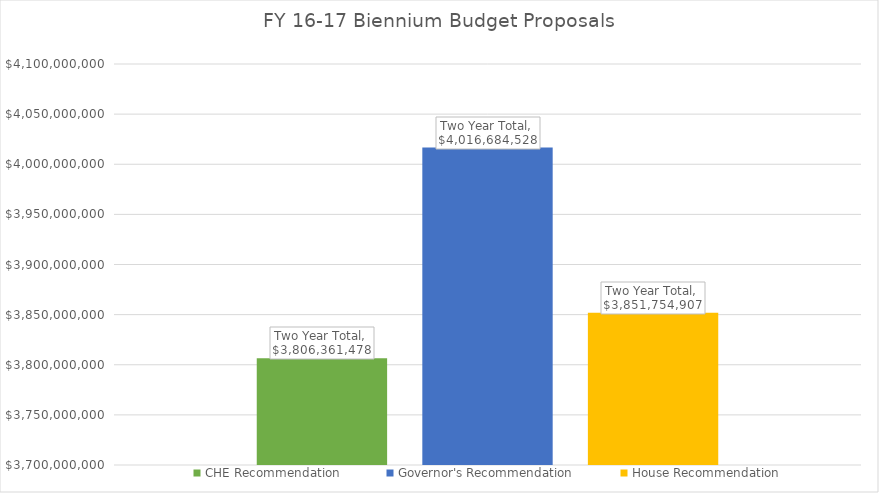
| Category | CHE Recommendation | Governor's Recommendation | House Recommendation |
|---|---|---|---|
| Two Year Total | 3806361478.458 | 4016684528.052 | 3851754906.973 |